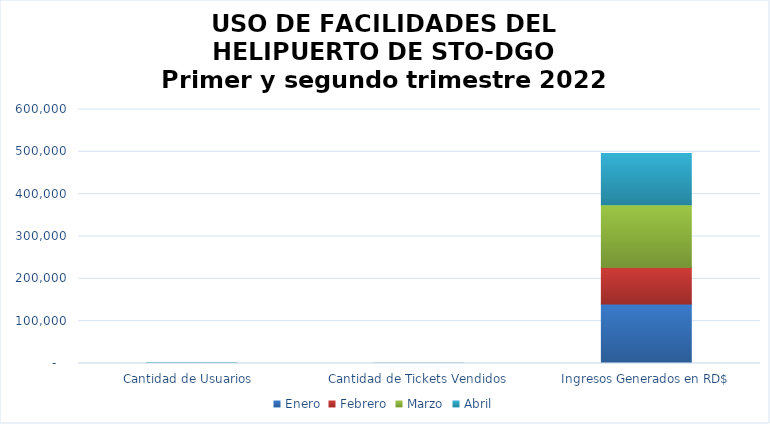
| Category | Enero | Febrero | Marzo | Abril |
|---|---|---|---|---|
| Cantidad de Usuarios  | 314 | 426 | 488 | 368 |
| Cantidad de Tickets Vendidos | 124 | 77 | 134 | 111 |
| Ingresos Generados en RD$ | 140480 | 86300 | 148074 | 121444 |